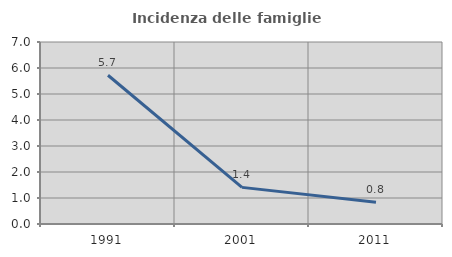
| Category | Incidenza delle famiglie numerose |
|---|---|
| 1991.0 | 5.721 |
| 2001.0 | 1.408 |
| 2011.0 | 0.836 |